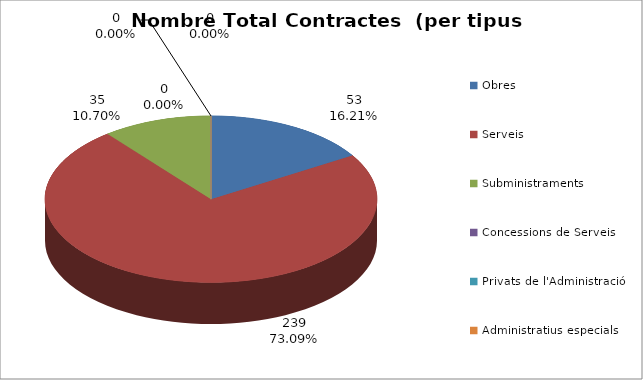
| Category | Nombre Total Contractes |
|---|---|
| Obres | 53 |
| Serveis | 239 |
| Subministraments | 35 |
| Concessions de Serveis | 0 |
| Privats de l'Administració | 0 |
| Administratius especials | 0 |